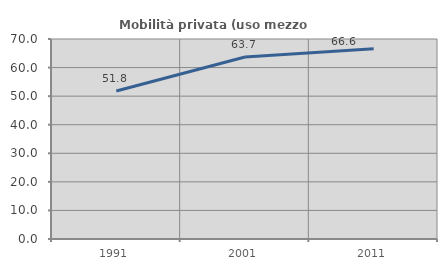
| Category | Mobilità privata (uso mezzo privato) |
|---|---|
| 1991.0 | 51.785 |
| 2001.0 | 63.726 |
| 2011.0 | 66.598 |